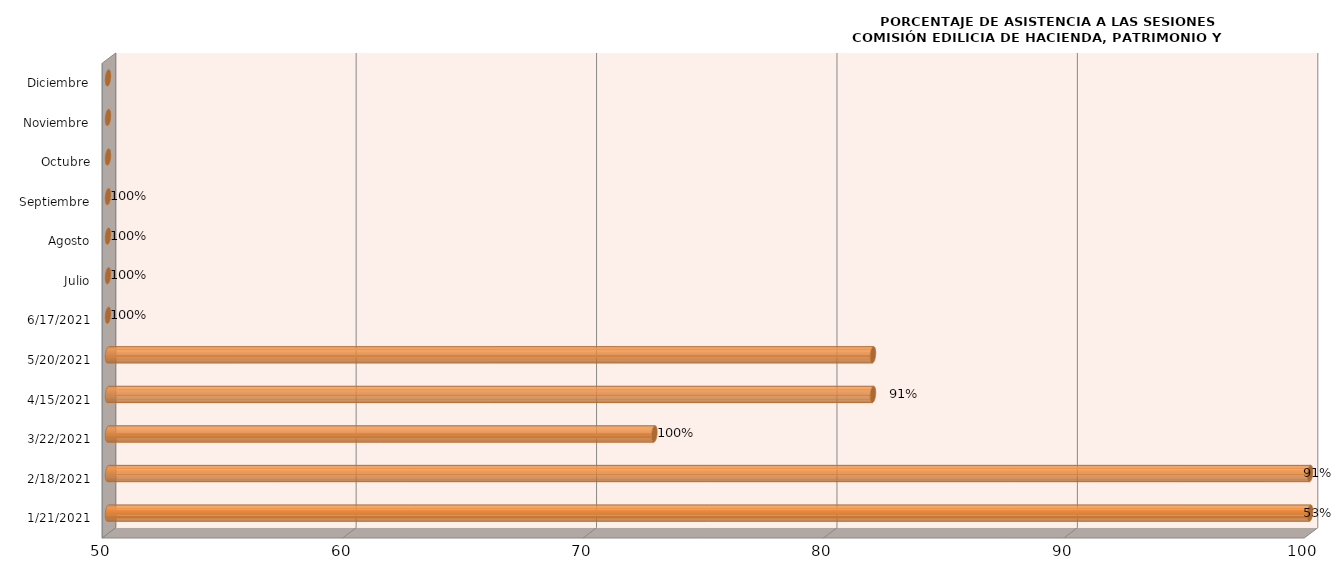
| Category | Series 0 |
|---|---|
| 21/01/2021 | 100 |
| 18/02/2021 | 100 |
| 22/03/2021 | 72.727 |
| 15/04/2021 | 81.818 |
| 20/05/2021 | 81.818 |
| 17/06/2021 | 45.455 |
| Julio | 0 |
| Agosto | 0 |
| Septiembre | 0 |
| Octubre | 0 |
| Noviembre | 0 |
| Diciembre | 0 |